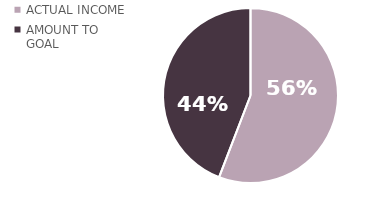
| Category | Series 0 |
|---|---|
| ACTUAL INCOME | 2792 |
| AMOUNT TO GOAL | 2208 |